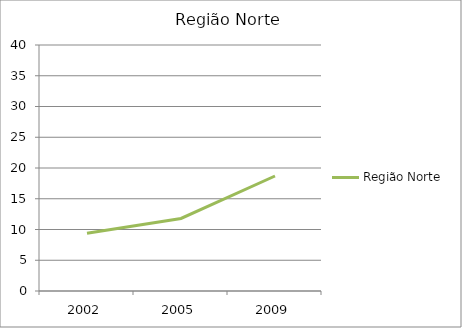
| Category | Região Norte |
|---|---|
| 2002.0 | 9.4 |
| 2005.0 | 11.8 |
| 2009.0 | 18.7 |